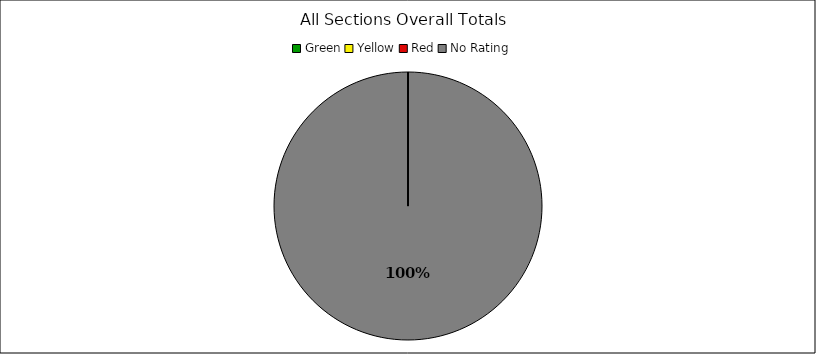
| Category | Series 0 |
|---|---|
| Green | 0 |
| Yellow | 0 |
| Red | 0 |
| No Rating | 53 |